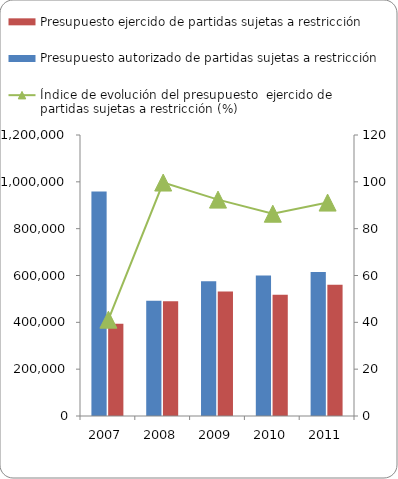
| Category | Presupuesto autorizado de partidas sujetas a restricción | Presupuesto ejercido de partidas sujetas a restricción  |
|---|---|---|
| 2007 | 958656 | 394382 |
| 2008 | 491777 | 490288 |
| 2009 | 575170 | 531486 |
| 2010 | 599924 | 518241 |
| 2011 | 614651 | 560225 |